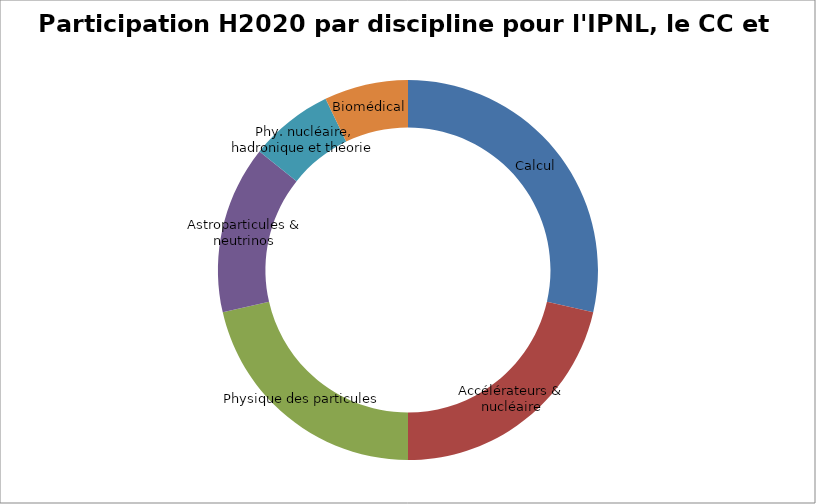
| Category | Series 0 | Series 1 |
|---|---|---|
| Calcul |  | 4 |
| Accélérateurs & nucléaire |  | 3 |
| Physique des particules |  | 3 |
| Astroparticules & neutrinos |  | 2 |
| Phy. nucléaire, hadronique et théorie |  | 1 |
| Biomédical |  | 1 |